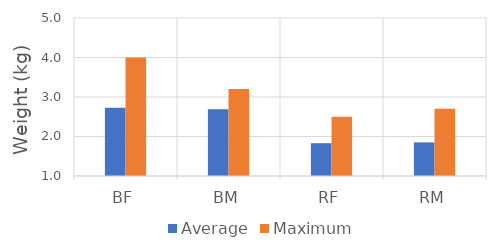
| Category | Average | Maximum |
|---|---|---|
| BF | 2.731 | 4 |
| BM | 2.69 | 3.2 |
| RF | 1.831 | 2.5 |
| RM | 1.851 | 2.7 |